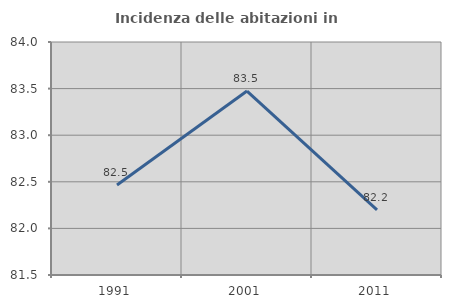
| Category | Incidenza delle abitazioni in proprietà  |
|---|---|
| 1991.0 | 82.466 |
| 2001.0 | 83.474 |
| 2011.0 | 82.198 |